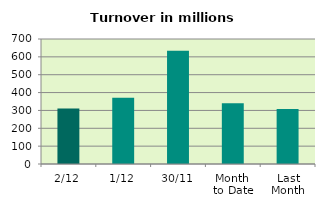
| Category | Series 0 |
|---|---|
| 2/12 | 310.312 |
| 1/12 | 371.466 |
| 30/11 | 633.782 |
| Month 
to Date | 340.889 |
| Last
Month | 307.664 |